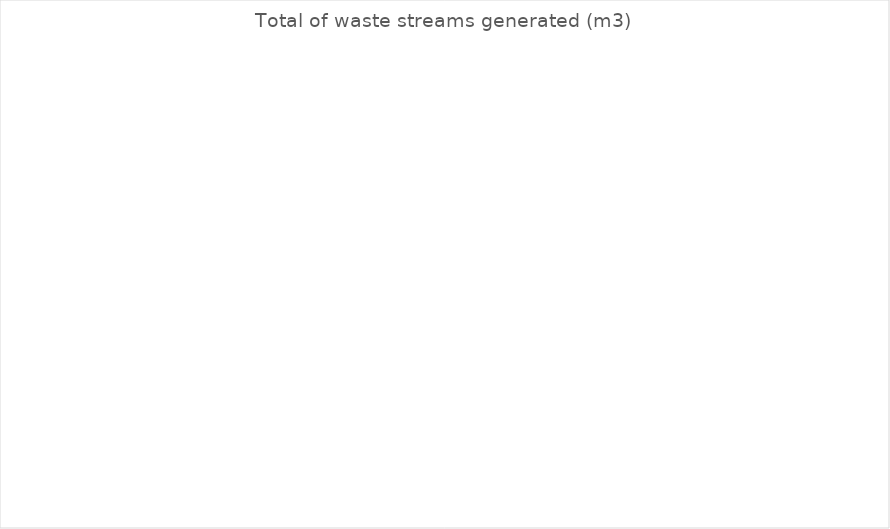
| Category |  Generated (m3)  |
|---|---|
| Excess Earthworks / Embankment / Fill | 0 |
| Acid Sulphate Soil | 0 |
| Other Contaminated Earthworks | 0 |
| Regulated Waste Cat 1 | 0 |
| Regulated Waste Cat 2 | 0 |
| Asphalt & Profiles (RAP) | 0 |
| Other Recovered Pavement Materials | 0 |
| Concrete | 0 |
| Metal | 0 |
| Vegetation | 0 |
| Other Construction Waste (Timber, glass, plastic, bricks) | 0 |
| Tyres & Rubber | 0 |
| General Refuse | 0 |
| Illegally Dumped Refuse | 0 |
| Office - General & Foodwaste | 0 |
| Office - Recyclables | 0 |
| Office - Paper | 0 |